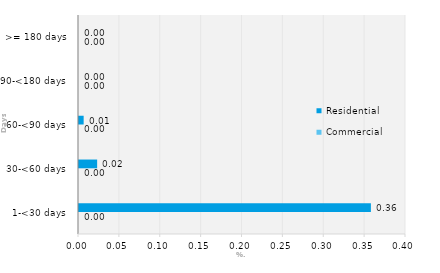
| Category | Commercial | Residential |
|---|---|---|
| 1-<30 days | 0 | 0.357 |
| 30-<60 days | 0 | 0.022 |
| 60-<90 days | 0 | 0.006 |
| 90-<180 days | 0 | 0 |
| >= 180 days | 0 | 0 |